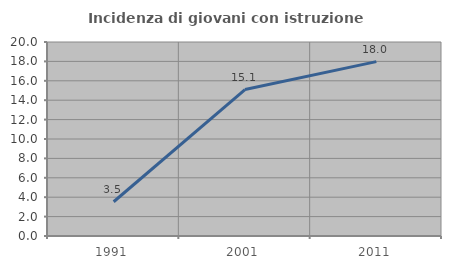
| Category | Incidenza di giovani con istruzione universitaria |
|---|---|
| 1991.0 | 3.529 |
| 2001.0 | 15.094 |
| 2011.0 | 17.978 |